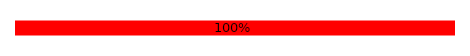
| Category | oui | non |
|---|---|---|
| 0.0 | 0 | 1 |